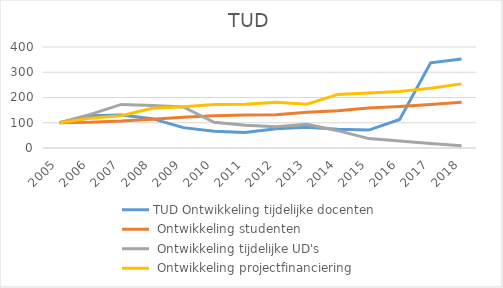
| Category | TUD Ontwikkeling tijdelijke docenten | TUD Ontwikkeling studenten | TUD Ontwikkeling tijdelijke UD's | TUD Ontwikkeling projectfinanciering |
|---|---|---|---|---|
| 2005.0 | 100 | 100 | 100 | 100 |
| 2006.0 | 127.419 | 101.652 | 133.333 | 118.128 |
| 2007.0 | 130.645 | 106.521 | 172.549 | 128.042 |
| 2008.0 | 116.129 | 114.258 | 168.627 | 157.016 |
| 2009.0 | 80.645 | 122.225 | 162.745 | 163.723 |
| 2010.0 | 66.129 | 127.823 | 101.961 | 171.983 |
| 2011.0 | 61.29 | 130.715 | 90.196 | 173.371 |
| 2012.0 | 75.806 | 131.843 | 84.314 | 181.386 |
| 2013.0 | 82.258 | 141.241 | 94.118 | 173.145 |
| 2014.0 | 74.194 | 147.776 | 68.627 | 212.136 |
| 2015.0 | 70.968 | 158.405 | 37.255 | 217.374 |
| 2016.0 | 112.903 | 163.871 | 27.451 | 223.483 |
| 2017.0 | 337.258 | 171.963 | 18.275 | 236.703 |
| 2018.0 | 352.065 | 180.777 | 9.216 | 254.002 |